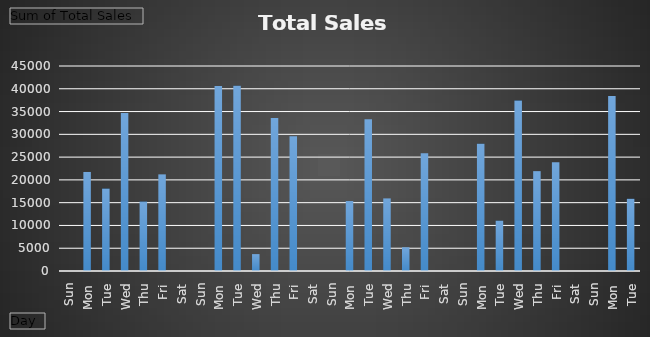
| Category | Total |
|---|---|
| Sun | 0 |
| Mon | 21741 |
| Tue | 18090 |
| Wed | 34680 |
| Thu | 15239 |
| Fri | 21212 |
| Sat | 0 |
| Sun | 0 |
| Mon | 40616 |
| Tue | 40669 |
| Wed | 3709 |
| Thu | 33611 |
| Fri | 29594 |
| Sat | 0 |
| Sun | 0 |
| Mon | 15356 |
| Tue | 33311 |
| Wed | 15938 |
| Thu | 5208 |
| Fri | 25863 |
| Sat | 0 |
| Sun | 0 |
| Mon | 27944 |
| Tue | 11045 |
| Wed | 37420 |
| Thu | 21921 |
| Fri | 23847 |
| Sat | 0 |
| Sun | 0 |
| Mon | 38392 |
| Tue | 15853 |